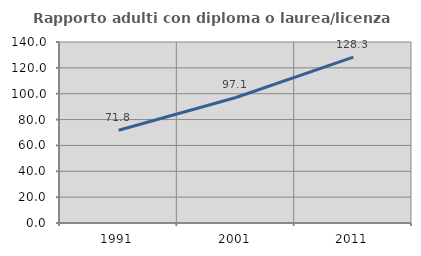
| Category | Rapporto adulti con diploma o laurea/licenza media  |
|---|---|
| 1991.0 | 71.751 |
| 2001.0 | 97.095 |
| 2011.0 | 128.309 |